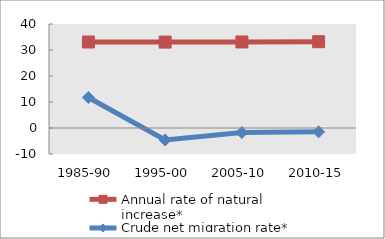
| Category | Annual rate of natural increase* | Crude net migration rate* |
|---|---|---|
| 1985-90 | 33.071 | 11.739 |
| 1995-00 | 33.04 | -4.605 |
| 2005-10 | 33.086 | -1.763 |
| 2010-15 | 33.19 | -1.477 |